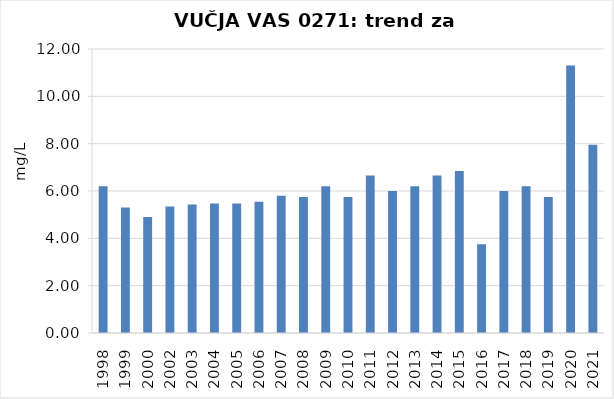
| Category | Vsota |
|---|---|
| 1998 | 6.2 |
| 1999 | 5.3 |
| 2000 | 4.9 |
| 2002 | 5.34 |
| 2003 | 5.425 |
| 2004 | 5.467 |
| 2005 | 5.467 |
| 2006 | 5.55 |
| 2007 | 5.8 |
| 2008 | 5.75 |
| 2009 | 6.2 |
| 2010 | 5.75 |
| 2011 | 6.65 |
| 2012 | 6 |
| 2013 | 6.2 |
| 2014 | 6.65 |
| 2015 | 6.85 |
| 2016 | 3.745 |
| 2017 | 6 |
| 2018 | 6.2 |
| 2019 | 5.75 |
| 2020 | 11.3 |
| 2021 | 7.95 |